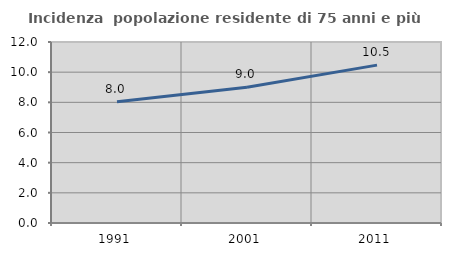
| Category | Incidenza  popolazione residente di 75 anni e più |
|---|---|
| 1991.0 | 8.04 |
| 2001.0 | 8.993 |
| 2011.0 | 10.466 |